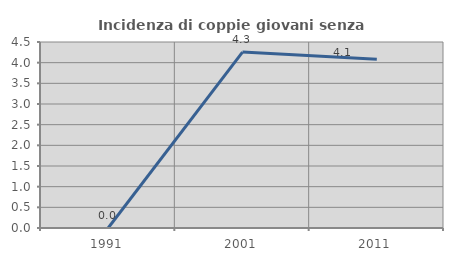
| Category | Incidenza di coppie giovani senza figli |
|---|---|
| 1991.0 | 0 |
| 2001.0 | 4.255 |
| 2011.0 | 4.082 |